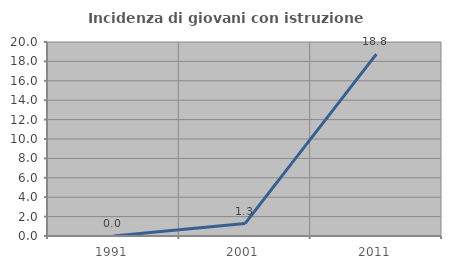
| Category | Incidenza di giovani con istruzione universitaria |
|---|---|
| 1991.0 | 0 |
| 2001.0 | 1.282 |
| 2011.0 | 18.75 |